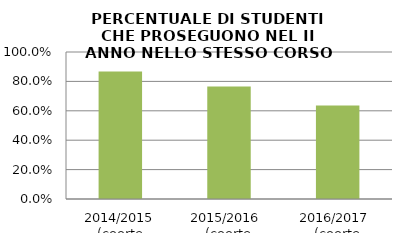
| Category | 2014/2015 (coorte 2013/14) 2015/2016  (coorte 2014/15) 2016/2017  (coorte 2015/16) |
|---|---|
| 2014/2015 (coorte 2013/14) | 0.867 |
| 2015/2016  (coorte 2014/15) | 0.765 |
| 2016/2017  (coorte 2015/16) | 0.636 |